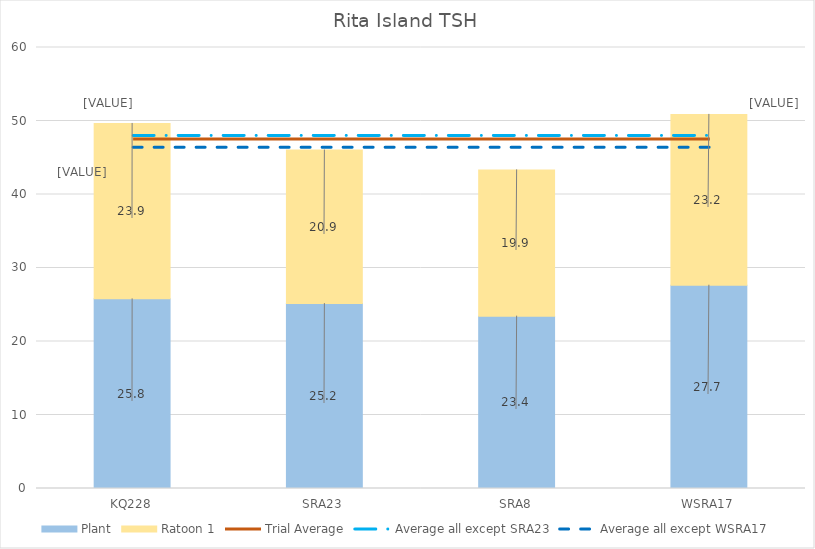
| Category | Plant | Ratoon 1 |
|---|---|---|
| KQ228 | 25.801 | 23.867 |
| SRA23 | 25.161 | 20.887 |
| SRA8 | 23.448 | 19.902 |
| WSRA17 | 27.658 | 23.24 |